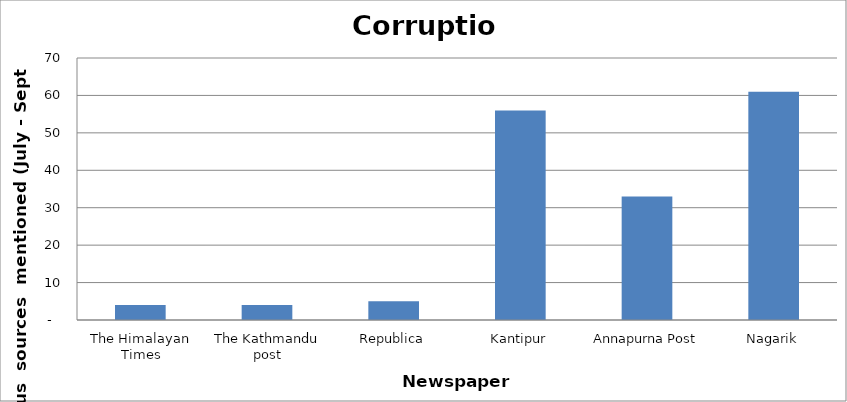
| Category | Corruption |
|---|---|
| The Himalayan Times | 4 |
| The Kathmandu post | 4 |
| Republica | 5 |
| Kantipur | 56 |
| Annapurna Post | 33 |
| Nagarik | 61 |